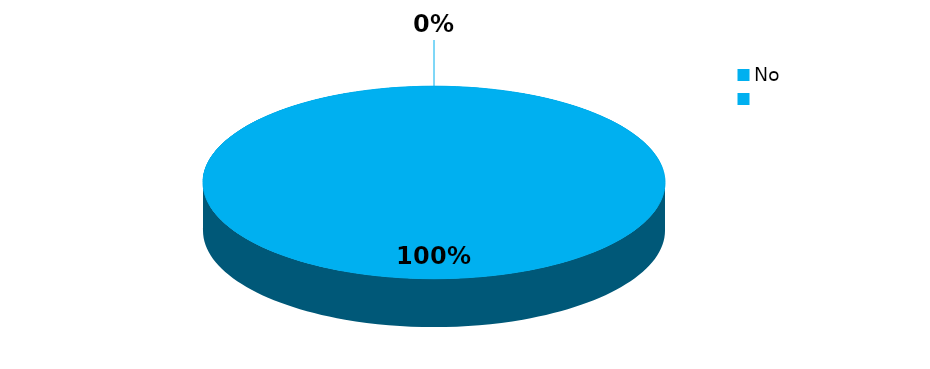
| Category | Series 0 |
|---|---|
| No | 5 |